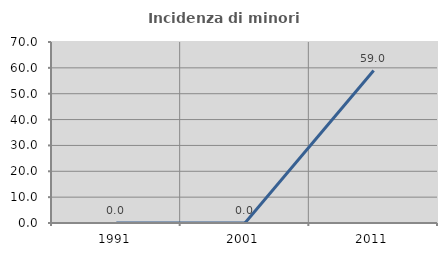
| Category | Incidenza di minori stranieri |
|---|---|
| 1991.0 | 0 |
| 2001.0 | 0 |
| 2011.0 | 58.974 |